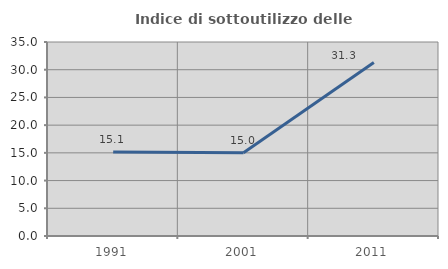
| Category | Indice di sottoutilizzo delle abitazioni  |
|---|---|
| 1991.0 | 15.144 |
| 2001.0 | 15 |
| 2011.0 | 31.316 |